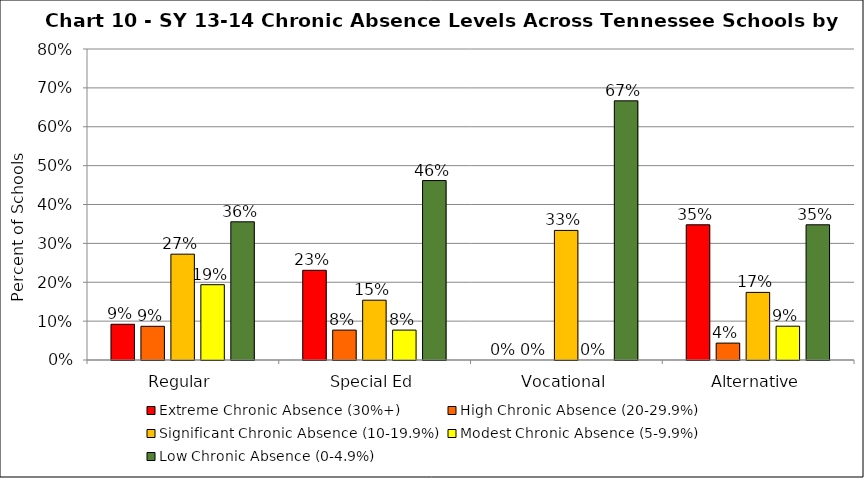
| Category | Extreme Chronic Absence (30%+) | High Chronic Absence (20-29.9%) | Significant Chronic Absence (10-19.9%) | Modest Chronic Absence (5-9.9%) | Low Chronic Absence (0-4.9%) |
|---|---|---|---|---|---|
| 0 | 0.092 | 0.087 | 0.272 | 0.194 | 0.355 |
| 1 | 0.231 | 0.077 | 0.154 | 0.077 | 0.462 |
| 2 | 0 | 0 | 0.333 | 0 | 0.667 |
| 3 | 0.348 | 0.043 | 0.174 | 0.087 | 0.348 |